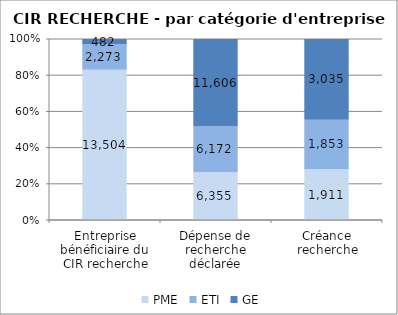
| Category | PME | ETI | GE |
|---|---|---|---|
| Entreprise bénéficiaire du CIR recherche | 13504 | 2273 | 482 |
| Dépense de recherche déclarée | 6354.76 | 6172.26 | 11606.05 |
| Créance recherche | 1910.54 | 1852.87 | 3035.23 |